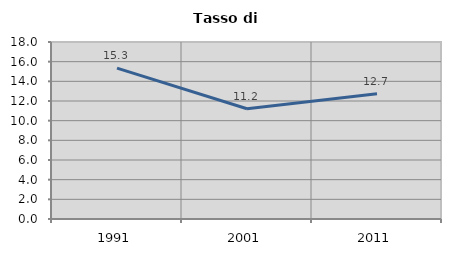
| Category | Tasso di disoccupazione   |
|---|---|
| 1991.0 | 15.345 |
| 2001.0 | 11.215 |
| 2011.0 | 12.736 |